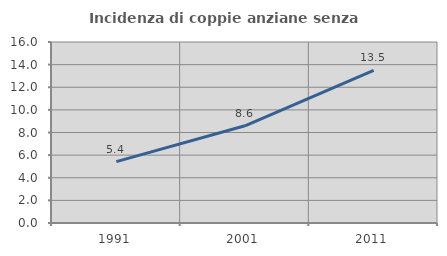
| Category | Incidenza di coppie anziane senza figli  |
|---|---|
| 1991.0 | 5.426 |
| 2001.0 | 8.594 |
| 2011.0 | 13.502 |